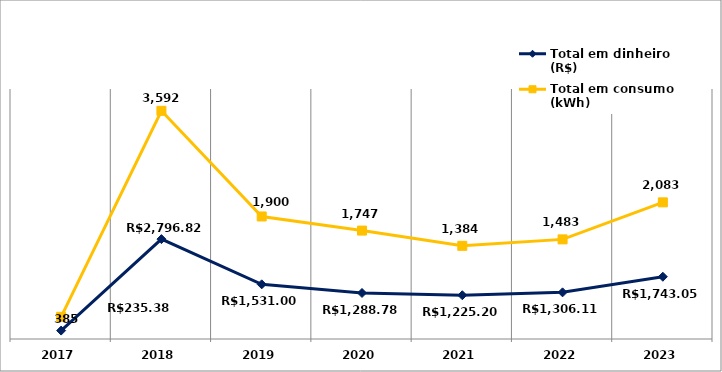
| Category | Total em dinheiro (R$) | Total em consumo (kWh) |
|---|---|---|
| 2017.0 | 235.38 | 385 |
| 2018.0 | 2796.82 | 3592 |
| 2019.0 | 1531 | 1900 |
| 2020.0 | 1288.78 | 1747 |
| 2021.0 | 1225.2 | 1384 |
| 2022.0 | 1306.11 | 1483 |
| 2023.0 | 1743.05 | 2083 |